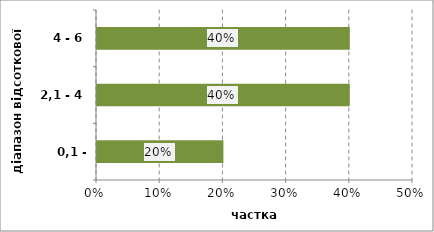
| Category | Series 0 |
|---|---|
| 0,1 - 2,1 | 0.2 |
| 2,1 - 4 | 0.4 |
| 4 - 6 | 0.4 |